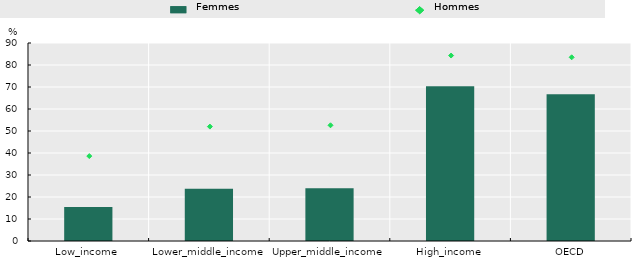
| Category | Women |
|---|---|
| Low_income | 15.4 |
| Lower_middle_income | 23.7 |
| Upper_middle_income | 24 |
| High_income | 70.3 |
| OECD | 66.7 |